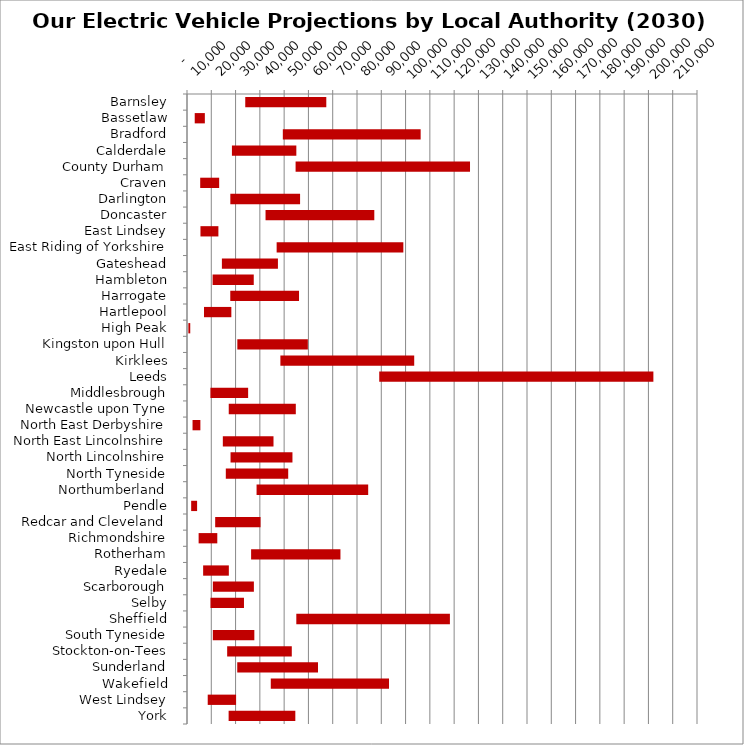
| Category | MIN | MAX |
|---|---|---|
| Barnsley | 23988 | 33368 |
| Bassetlaw | 3181 | 4167 |
| Bradford | 39456 | 56755 |
| Calderdale | 18496 | 26524 |
| County Durham | 44715 | 71820 |
| Craven | 5435 | 7812 |
| Darlington | 17844 | 28719 |
| Doncaster | 32341 | 44783 |
| East Lindsey | 5543 | 7384 |
| East Riding of Yorkshire | 36911 | 52174 |
| Gateshead | 14366 | 23077 |
| Hambleton | 10547 | 16941 |
| Harrogate | 17819 | 28308 |
| Hartlepool | 7001 | 11260 |
| High Peak | 560 | 776 |
| Kingston upon Hull | 20728 | 29034 |
| Kirklees | 38454 | 55104 |
| Leeds | 79156 | 112883 |
| Middlesbrough | 9647 | 15526 |
| Newcastle upon Tyne | 17188 | 27616 |
| North East Derbyshire | 2281 | 3228 |
| North East Lincolnshire | 14754 | 20863 |
| North Lincolnshire | 17931 | 25490 |
| North Tyneside | 15981 | 25693 |
| Northumberland | 28648 | 45960 |
| Pendle | 1718 | 2442 |
| Redcar and Cleveland | 11605 | 18680 |
| Richmondshire | 4786 | 7688 |
| Rotherham | 26397 | 36787 |
| Ryedale | 6644 | 10585 |
| Scarborough | 10652 | 16887 |
| Selby | 9679 | 13782 |
| Sheffield | 45010 | 63245 |
| South Tyneside | 10639 | 17089 |
| Stockton-on-Tees | 16539 | 26609 |
| Sunderland | 20691 | 33249 |
| Wakefield | 34495 | 48687 |
| West Lindsey | 8531 | 11670 |
| York | 17141 | 27463 |